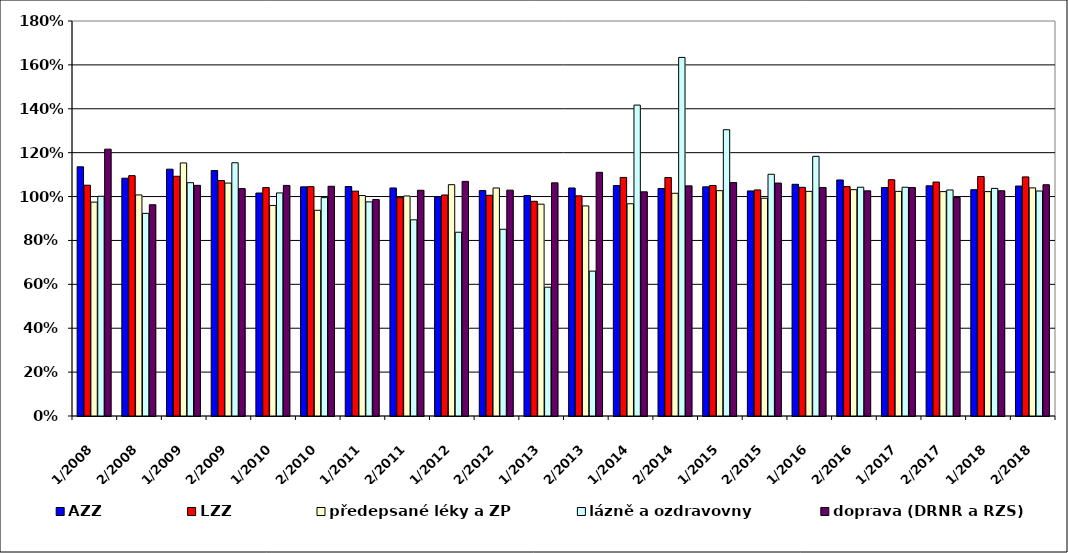
| Category | AZZ | LZZ | předepsané léky a ZP | lázně a ozdravovny | doprava (DRNR a RZS) |
|---|---|---|---|---|---|
| 1/2008 | 1.135 | 1.052 | 0.975 | 1.001 | 1.216 |
| 2/2008 | 1.084 | 1.095 | 1.007 | 0.923 | 0.963 |
| 1/2009 | 1.125 | 1.092 | 1.153 | 1.063 | 1.051 |
| 2/2009 | 1.118 | 1.073 | 1.061 | 1.154 | 1.036 |
| 1/2010 | 1.016 | 1.041 | 0.96 | 1.017 | 1.051 |
| 2/2010 | 1.044 | 1.045 | 0.938 | 0.995 | 1.047 |
| 1/2011 | 1.046 | 1.025 | 1.005 | 0.976 | 0.987 |
| 2/2011 | 1.039 | 0.995 | 1.003 | 0.894 | 1.029 |
| 1/2012 | 0.999 | 1.007 | 1.054 | 0.837 | 1.069 |
| 2/2012 | 1.027 | 1.006 | 1.039 | 0.851 | 1.029 |
| 1/2013 | 1.005 | 0.978 | 0.965 | 0.587 | 1.062 |
| 2/2013 | 1.039 | 1.003 | 0.957 | 0.66 | 1.11 |
| 1/2014 | 1.05 | 1.087 | 0.967 | 1.417 | 1.022 |
| 2/2014 | 1.037 | 1.087 | 1.015 | 1.634 | 1.049 |
| 1/2015 | 1.044 | 1.05 | 1.027 | 1.305 | 1.064 |
| 2/2015 | 1.026 | 1.03 | 0.992 | 1.101 | 1.061 |
| 1/2016 | 1.056 | 1.042 | 1.024 | 1.183 | 1.041 |
| 2/2016 | 1.076 | 1.045 | 1.031 | 1.043 | 1.026 |
| 1/2017 | 1.041 | 1.077 | 1.024 | 1.043 | 1.041 |
| 2/2017 | 1.049 | 1.066 | 1.023 | 1.03 | 0.996 |
| 1/2018 | 1.031 | 1.091 | 1.023 | 1.037 | 1.027 |
| 2/2018 | 1.048 | 1.09 | 1.04 | 1.025 | 1.054 |